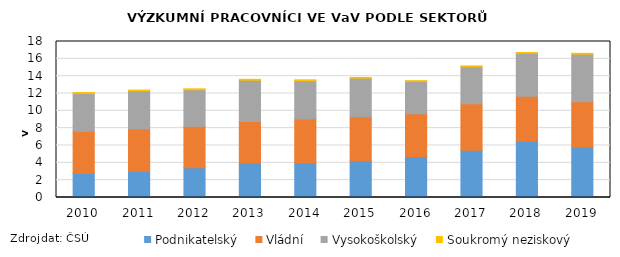
| Category | Podnikatelský | Vládní | Vysokoškolský | Soukromý neziskový |
|---|---|---|---|---|
| 2010.0 | 2780.321 | 4854.03 | 4364.486 | 115.283 |
| 2011.0 | 3007.913 | 4913.014 | 4375.205 | 98.466 |
| 2012.0 | 3438.911 | 4770.967 | 4223.552 | 107.055 |
| 2013.0 | 3991.398 | 4767.869 | 4771.77 | 105.54 |
| 2014.0 | 4019.67 | 5046.88 | 4409.936 | 103.807 |
| 2015.0 | 4266.749 | 5056.65 | 4446.236 | 84.845 |
| 2016.0 | 4732.03 | 4922.864 | 3741.095 | 86.525 |
| 2017.0 | 5445.581 | 5368.791 | 4274.354 | 98.513 |
| 2018.0 | 6490.719 | 5193.872 | 4958.618 | 83.417 |
| 2019.0 | 5836.22 | 5215.657 | 5489.461 | 95.697 |